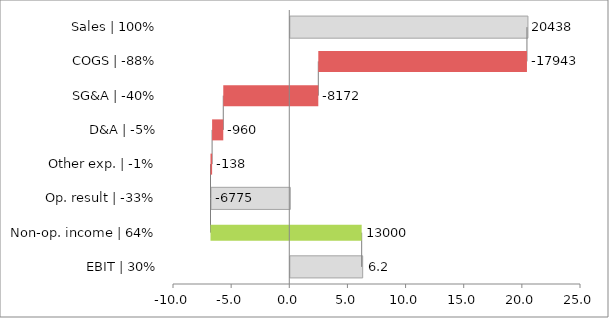
| Category | totals |
|---|---|
| Sales | 100% | 20438 |
| COGS | -88% | 0 |
| SG&A | -40% | 0 |
| D&A | -5% | 0 |
| Other exp. | -1% | 0 |
| Op. result | -33% | -6775 |
| Non-op. income | 64% | 0 |
| EBIT | 30% | 6225 |